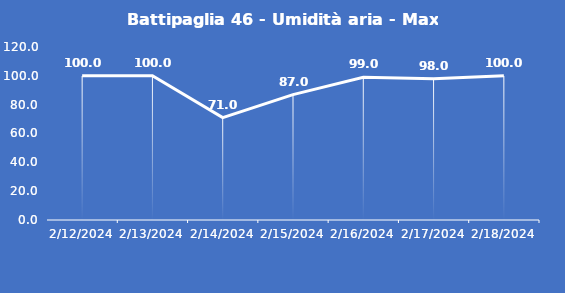
| Category | Battipaglia 46 - Umidità aria - Max (%) |
|---|---|
| 2/12/24 | 100 |
| 2/13/24 | 100 |
| 2/14/24 | 71 |
| 2/15/24 | 87 |
| 2/16/24 | 99 |
| 2/17/24 | 98 |
| 2/18/24 | 100 |